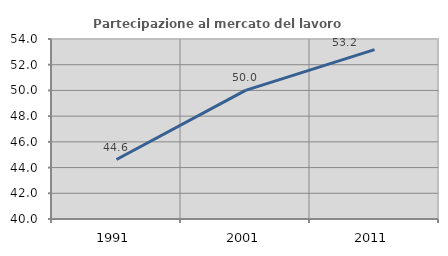
| Category | Partecipazione al mercato del lavoro  femminile |
|---|---|
| 1991.0 | 44.627 |
| 2001.0 | 50 |
| 2011.0 | 53.171 |